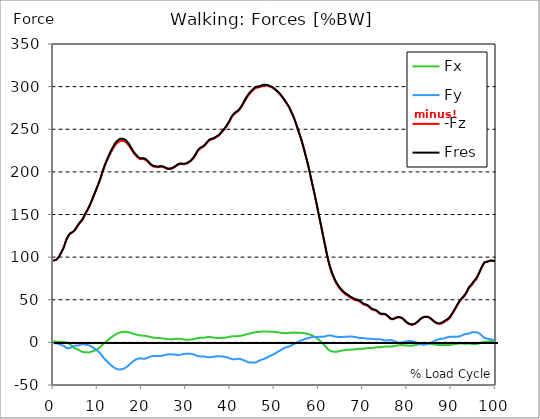
| Category |  Fx |  Fy |  -Fz |  Fres |
|---|---|---|---|---|
| 0.0 | 1.156 | -0.645 | 95.573 | 95.616 |
| 0.167348456675344 | 1.192 | -0.879 | 96.051 | 96.096 |
| 0.334696913350688 | 1.198 | -1.062 | 96.456 | 96.499 |
| 0.5020453700260321 | 1.049 | -1.068 | 96.72 | 96.764 |
| 0.669393826701376 | 0.87 | -1.04 | 96.957 | 97.005 |
| 0.83674228337672 | 0.809 | -1.318 | 97.771 | 97.825 |
| 1.0040907400520642 | 0.701 | -1.536 | 98.63 | 98.695 |
| 1.1621420602454444 | 0.6 | -1.845 | 99.788 | 99.866 |
| 1.3294905169207885 | 0.552 | -2.182 | 101.139 | 101.228 |
| 1.4968389735961325 | 0.556 | -2.518 | 102.6 | 102.702 |
| 1.6641874302714765 | 0.561 | -2.857 | 104.181 | 104.295 |
| 1.8315358869468206 | 0.558 | -3.168 | 105.804 | 105.93 |
| 1.9988843436221646 | 0.429 | -3.5 | 107.55 | 107.69 |
| 2.1662328002975086 | 0.328 | -3.84 | 109.35 | 109.507 |
| 2.333581256972853 | 0.22 | -4.194 | 111.26 | 111.43 |
| 2.5009297136481967 | 0.17 | -4.649 | 113.478 | 113.666 |
| 2.6682781703235405 | 0.196 | -5.332 | 116.042 | 116.263 |
| 2.8356266269988843 | 0.195 | -6.129 | 118.728 | 118.99 |
| 3.002975083674229 | -0.019 | -6.548 | 120.91 | 121.189 |
| 3.1703235403495724 | -0.459 | -6.707 | 122.649 | 122.938 |
| 3.337671997024917 | -0.844 | -6.951 | 124.301 | 124.606 |
| 3.4957233172182973 | -1.311 | -7.036 | 125.766 | 126.08 |
| 3.663071773893641 | -1.941 | -6.802 | 126.87 | 127.18 |
| 3.8304202305689854 | -2.616 | -6.432 | 127.683 | 127.983 |
| 3.997768687244329 | -3.416 | -5.903 | 128.219 | 128.512 |
| 4.165117143919673 | -4.283 | -5.321 | 128.619 | 128.911 |
| 4.332465600595017 | -5.116 | -4.802 | 129.119 | 129.43 |
| 4.499814057270361 | -5.872 | -4.375 | 129.69 | 130.023 |
| 4.667162513945706 | -6.461 | -4.115 | 130.492 | 130.853 |
| 4.834510970621049 | -7.047 | -3.798 | 131.417 | 131.809 |
| 5.001859427296393 | -7.404 | -3.682 | 132.612 | 133.017 |
| 5.169207883971737 | -7.706 | -3.648 | 133.901 | 134.317 |
| 5.336556340647081 | -7.973 | -3.677 | 135.261 | 135.69 |
| 5.503904797322425 | -8.278 | -3.597 | 136.581 | 137.015 |
| 5.671253253997769 | -8.612 | -3.504 | 137.969 | 138.408 |
| 5.82930457419115 | -9.087 | -3.337 | 139.183 | 139.631 |
| 5.996653030866494 | -9.593 | -3.096 | 140.275 | 140.735 |
| 6.164001487541838 | -10.127 | -2.754 | 141.275 | 141.753 |
| 6.331349944217181 | -10.672 | -2.383 | 142.25 | 142.75 |
| 6.498698400892526 | -11.134 | -2.033 | 143.225 | 143.75 |
| 6.66604685756787 | -11.376 | -1.953 | 144.61 | 145.144 |
| 6.833395314243213 | -11.457 | -2.185 | 146.348 | 146.883 |
| 7.000743770918558 | -11.501 | -2.461 | 148.157 | 148.693 |
| 7.168092227593902 | -11.536 | -2.763 | 150.05 | 150.584 |
| 7.335440684269246 | -11.675 | -2.797 | 151.616 | 152.152 |
| 7.50278914094459 | -11.689 | -2.891 | 153.097 | 153.634 |
| 7.6701375976199335 | -11.684 | -3.032 | 154.637 | 155.175 |
| 7.837486054295278 | -11.745 | -3.15 | 156.245 | 156.785 |
| 7.995537374488658 | -11.756 | -3.319 | 157.92 | 158.462 |
| 8.162885831164003 | -11.648 | -3.634 | 159.749 | 160.289 |
| 8.330234287839346 | -11.443 | -4.078 | 161.693 | 162.23 |
| 8.49758274451469 | -11.195 | -4.568 | 163.729 | 164.26 |
| 8.664931201190035 | -10.897 | -5.084 | 165.847 | 166.368 |
| 8.832279657865378 | -10.568 | -5.662 | 168.018 | 168.534 |
| 8.999628114540721 | -10.205 | -6.308 | 170.234 | 170.75 |
| 9.166976571216066 | -9.95 | -6.835 | 172.329 | 172.849 |
| 9.334325027891412 | -9.61 | -7.42 | 174.436 | 174.962 |
| 9.501673484566755 | -9.252 | -7.993 | 176.505 | 177.036 |
| 9.669021941242098 | -8.805 | -8.607 | 178.583 | 179.12 |
| 9.836370397917442 | -8.246 | -9.299 | 180.79 | 181.333 |
| 10.003718854592787 | -7.702 | -9.963 | 183 | 183.55 |
| 10.17106731126813 | -7.101 | -10.708 | 185.226 | 185.792 |
| 10.329118631461512 | -6.478 | -11.482 | 187.523 | 188.101 |
| 10.496467088136853 | -5.808 | -12.334 | 189.855 | 190.455 |
| 10.663815544812199 | -5.064 | -13.301 | 192.307 | 192.948 |
| 10.831164001487544 | -4.179 | -14.495 | 195.017 | 195.717 |
| 10.998512458162887 | -3.233 | -15.789 | 197.836 | 198.596 |
| 11.16586091483823 | -2.393 | -16.877 | 200.404 | 201.229 |
| 11.333209371513574 | -1.591 | -17.906 | 202.864 | 203.753 |
| 11.50055782818892 | -0.795 | -18.9 | 205.273 | 206.225 |
| 11.667906284864264 | -0.002 | -19.897 | 207.598 | 208.626 |
| 11.835254741539607 | 0.733 | -20.819 | 209.733 | 210.839 |
| 12.00260319821495 | 1.413 | -21.647 | 211.745 | 212.92 |
| 12.169951654890292 | 2.081 | -22.461 | 213.702 | 214.95 |
| 12.337300111565641 | 2.765 | -23.325 | 215.614 | 216.944 |
| 12.504648568240984 | 3.452 | -24.168 | 217.438 | 218.86 |
| 12.662699888434362 | 4.148 | -25.009 | 219.259 | 220.774 |
| 12.830048345109708 | 4.838 | -25.835 | 221.072 | 222.679 |
| 12.997396801785053 | 5.515 | -26.644 | 222.837 | 224.536 |
| 13.164745258460396 | 6.169 | -27.405 | 224.463 | 226.259 |
| 13.33209371513574 | 6.839 | -28.13 | 225.992 | 227.889 |
| 13.499442171811083 | 7.364 | -28.673 | 227.35 | 229.323 |
| 13.666790628486426 | 7.888 | -29.215 | 228.743 | 230.792 |
| 13.834139085161771 | 8.485 | -29.844 | 230.244 | 232.381 |
| 14.001487541837117 | 9.052 | -30.396 | 231.506 | 233.728 |
| 14.16883599851246 | 9.585 | -30.879 | 232.575 | 234.875 |
| 14.336184455187803 | 10.043 | -31.222 | 233.457 | 235.817 |
| 14.503532911863147 | 10.451 | -31.477 | 234.224 | 236.632 |
| 14.670881368538492 | 10.82 | -31.675 | 234.951 | 237.398 |
| 14.828932688731873 | 11.166 | -31.831 | 235.625 | 238.105 |
| 14.996281145407215 | 11.479 | -31.909 | 236.106 | 238.61 |
| 15.163629602082558 | 11.718 | -31.825 | 236.374 | 238.878 |
| 15.330978058757903 | 11.907 | -31.61 | 236.504 | 238.99 |
| 15.498326515433247 | 12.103 | -31.43 | 236.517 | 238.99 |
| 15.665674972108594 | 12.251 | -31.197 | 236.469 | 238.92 |
| 15.833023428783937 | 12.365 | -30.957 | 236.367 | 238.795 |
| 16.00037188545928 | 12.425 | -30.54 | 236.059 | 238.441 |
| 16.167720342134626 | 12.43 | -30.09 | 235.655 | 237.984 |
| 16.335068798809967 | 12.387 | -29.576 | 235.058 | 237.326 |
| 16.502417255485312 | 12.305 | -28.983 | 234.344 | 236.538 |
| 16.669765712160658 | 12.171 | -28.352 | 233.485 | 235.6 |
| 16.837114168836 | 12.022 | -27.717 | 232.579 | 234.614 |
| 17.004462625511344 | 11.805 | -26.957 | 231.429 | 233.37 |
| 17.16251394570472 | 11.6 | -26.179 | 230.204 | 232.05 |
| 17.32986240238007 | 11.318 | -25.332 | 228.784 | 230.531 |
| 17.497210859055414 | 11.029 | -24.582 | 227.521 | 229.182 |
| 17.664559315730756 | 10.739 | -23.778 | 226.227 | 227.795 |
| 17.8319077724061 | 10.461 | -22.94 | 224.794 | 226.269 |
| 17.999256229081443 | 10.201 | -22.183 | 223.338 | 224.733 |
| 18.166604685756788 | 9.954 | -21.577 | 222.08 | 223.409 |
| 18.333953142432133 | 9.676 | -21.027 | 220.966 | 222.231 |
| 18.501301599107478 | 9.434 | -20.632 | 220.08 | 221.302 |
| 18.668650055782823 | 9.207 | -20.182 | 219.156 | 220.332 |
| 18.835998512458165 | 8.947 | -19.792 | 218.259 | 219.391 |
| 19.00334696913351 | 8.743 | -19.457 | 217.411 | 218.506 |
| 19.170695425808855 | 8.555 | -19.139 | 216.545 | 217.606 |
| 19.338043882484197 | 8.345 | -18.799 | 215.688 | 216.715 |
| 19.496095202677576 | 8.168 | -18.661 | 215.199 | 216.208 |
| 19.66344365935292 | 8.068 | -18.703 | 215.017 | 216.027 |
| 19.830792116028263 | 7.986 | -18.775 | 214.943 | 215.956 |
| 19.998140572703612 | 7.949 | -19.069 | 215.137 | 216.174 |
| 20.165489029378953 | 7.933 | -19.319 | 215.137 | 216.195 |
| 20.3328374860543 | 7.886 | -19.301 | 214.925 | 215.981 |
| 20.500185942729644 | 7.823 | -19.191 | 214.754 | 215.797 |
| 20.667534399404985 | 7.72 | -19.084 | 214.539 | 215.57 |
| 20.83488285608033 | 7.577 | -18.937 | 214.148 | 215.162 |
| 21.002231312755672 | 7.435 | -18.732 | 213.541 | 214.536 |
| 21.16957976943102 | 7.286 | -18.44 | 212.879 | 213.848 |
| 21.336928226106362 | 7.082 | -18.045 | 212.01 | 212.944 |
| 21.504276682781704 | 6.829 | -17.583 | 211.006 | 211.903 |
| 21.67162513945705 | 6.624 | -17.24 | 210.076 | 210.945 |
| 21.82967645965043 | 6.406 | -16.873 | 209.191 | 210.026 |
| 21.997024916325774 | 6.191 | -16.549 | 208.387 | 209.193 |
| 22.16437337300112 | 5.997 | -16.313 | 207.683 | 208.467 |
| 22.33172182967646 | 5.845 | -16.135 | 207.062 | 207.831 |
| 22.499070286351806 | 5.683 | -16.084 | 206.548 | 207.31 |
| 22.666418743027148 | 5.591 | -16.019 | 206.222 | 206.98 |
| 22.833767199702496 | 5.508 | -15.999 | 206.086 | 206.84 |
| 23.00111565637784 | 5.448 | -16.043 | 206.044 | 206.797 |
| 23.168464113053183 | 5.379 | -16.048 | 205.938 | 206.688 |
| 23.335812569728528 | 5.273 | -15.972 | 205.673 | 206.414 |
| 23.50316102640387 | 5.163 | -15.943 | 205.417 | 206.152 |
| 23.670509483079215 | 5.117 | -15.933 | 205.468 | 206.202 |
| 23.83785793975456 | 5.074 | -15.934 | 205.579 | 206.311 |
| 23.995909259947936 | 5.05 | -15.941 | 205.781 | 206.512 |
| 24.163257716623285 | 5.012 | -15.923 | 205.977 | 206.705 |
| 24.330606173298627 | 4.903 | -15.825 | 206.082 | 206.798 |
| 24.49795462997397 | 4.806 | -15.74 | 206.108 | 206.816 |
| 24.665303086649313 | 4.713 | -15.621 | 205.93 | 206.626 |
| 24.83265154332466 | 4.63 | -15.478 | 205.609 | 206.293 |
| 25.0 | 4.545 | -15.304 | 205.274 | 205.943 |
| 25.167348456675345 | 4.402 | -15.088 | 204.918 | 205.572 |
| 25.334696913350694 | 4.227 | -14.845 | 204.5 | 205.135 |
| 25.502045370026035 | 4.049 | -14.575 | 204.024 | 204.64 |
| 25.669393826701377 | 3.885 | -14.32 | 203.588 | 204.185 |
| 25.836742283376722 | 3.777 | -14.128 | 203.306 | 203.888 |
| 26.004090740052067 | 3.712 | -14.017 | 203.219 | 203.795 |
| 26.17143919672741 | 3.695 | -14.006 | 203.262 | 203.839 |
| 26.329490516920792 | 3.67 | -13.998 | 203.297 | 203.875 |
| 26.49683897359613 | 3.652 | -14 | 203.373 | 203.952 |
| 26.66418743027148 | 3.672 | -14.029 | 203.612 | 204.194 |
| 26.831535886946828 | 3.717 | -14.098 | 203.983 | 204.571 |
| 26.998884343622166 | 3.759 | -14.161 | 204.36 | 204.95 |
| 27.166232800297514 | 3.809 | -14.217 | 204.756 | 205.349 |
| 27.333581256972852 | 3.885 | -14.289 | 205.251 | 205.848 |
| 27.5009297136482 | 3.962 | -14.359 | 205.805 | 206.405 |
| 27.668278170323543 | 4.053 | -14.491 | 206.514 | 207.122 |
| 27.835626626998888 | 4.139 | -14.63 | 207.214 | 207.83 |
| 28.002975083674233 | 4.186 | -14.721 | 207.781 | 208.401 |
| 28.170323540349575 | 4.204 | -14.746 | 208.245 | 208.864 |
| 28.33767199702492 | 4.198 | -14.754 | 208.661 | 209.279 |
| 28.50502045370026 | 4.172 | -14.699 | 209.038 | 209.649 |
| 28.663071773893645 | 4.094 | -14.54 | 209.251 | 209.848 |
| 28.830420230568986 | 3.98 | -14.346 | 209.346 | 209.924 |
| 28.99776868724433 | 3.821 | -14.113 | 209.266 | 209.826 |
| 29.165117143919673 | 3.661 | -13.913 | 209.159 | 209.703 |
| 29.33246560059502 | 3.509 | -13.748 | 209.067 | 209.597 |
| 29.499814057270367 | 3.371 | -13.6 | 209.026 | 209.544 |
| 29.66716251394571 | 3.258 | -13.487 | 209.083 | 209.59 |
| 29.834510970621054 | 3.173 | -13.392 | 209.228 | 209.725 |
| 30.00185942729639 | 3.129 | -13.338 | 209.493 | 209.983 |
| 30.169207883971744 | 3.125 | -13.355 | 209.837 | 210.326 |
| 30.33655634064708 | 3.135 | -13.356 | 210.309 | 210.795 |
| 30.50390479732243 | 3.149 | -13.35 | 210.805 | 211.289 |
| 30.671253253997772 | 3.164 | -13.317 | 211.285 | 211.767 |
| 30.829304574191156 | 3.224 | -13.345 | 211.861 | 212.343 |
| 30.996653030866494 | 3.297 | -13.389 | 212.465 | 212.95 |
| 31.164001487541842 | 3.414 | -13.535 | 213.272 | 213.766 |
| 31.331349944217187 | 3.554 | -13.695 | 214.18 | 214.684 |
| 31.498698400892525 | 3.717 | -13.895 | 215.188 | 215.707 |
| 31.666046857567874 | 3.883 | -14.12 | 216.262 | 216.795 |
| 31.833395314243212 | 4.052 | -14.373 | 217.372 | 217.922 |
| 32.00074377091856 | 4.234 | -14.683 | 218.732 | 219.307 |
| 32.1680922275939 | 4.448 | -15.038 | 220.179 | 220.781 |
| 32.33544068426925 | 4.715 | -15.505 | 221.775 | 222.414 |
| 32.50278914094459 | 4.932 | -15.893 | 223.312 | 223.984 |
| 32.670137597619934 | 5.084 | -16.152 | 224.628 | 225.324 |
| 32.83748605429528 | 5.192 | -16.326 | 225.697 | 226.405 |
| 33.004834510970625 | 5.251 | -16.399 | 226.531 | 227.243 |
| 33.162885831164004 | 5.312 | -16.438 | 227.279 | 227.991 |
| 33.33023428783935 | 5.335 | -16.444 | 227.923 | 228.637 |
| 33.497582744514695 | 5.34 | -16.443 | 228.385 | 229.098 |
| 33.664931201190036 | 5.358 | -16.432 | 228.843 | 229.553 |
| 33.83227965786538 | 5.382 | -16.418 | 229.306 | 230.015 |
| 33.99962811454073 | 5.445 | -16.465 | 229.868 | 230.58 |
| 34.16697657121607 | 5.563 | -16.58 | 230.583 | 231.301 |
| 34.33432502789141 | 5.722 | -16.729 | 231.478 | 232.206 |
| 34.50167348456676 | 5.886 | -16.899 | 232.482 | 233.22 |
| 34.6690219412421 | 6.05 | -17.105 | 233.643 | 234.397 |
| 34.83637039791744 | 6.139 | -17.284 | 234.729 | 235.496 |
| 35.00371885459279 | 6.233 | -17.445 | 235.704 | 236.483 |
| 35.17106731126814 | 6.288 | -17.524 | 236.534 | 237.318 |
| 35.338415767943474 | 6.289 | -17.513 | 237.192 | 237.972 |
| 35.49646708813686 | 6.214 | -17.427 | 237.657 | 238.427 |
| 35.6638155448122 | 6.085 | -17.288 | 238.002 | 238.756 |
| 35.831164001487544 | 5.923 | -17.111 | 238.24 | 238.974 |
| 35.998512458162885 | 5.743 | -16.925 | 238.404 | 239.118 |
| 36.165860914838234 | 5.65 | -16.865 | 238.772 | 239.478 |
| 36.333209371513576 | 5.572 | -16.828 | 239.209 | 239.91 |
| 36.50055782818892 | 5.45 | -16.713 | 239.669 | 240.357 |
| 36.667906284864266 | 5.378 | -16.603 | 240.248 | 240.923 |
| 36.83525474153961 | 5.3 | -16.465 | 240.804 | 241.467 |
| 37.002603198214956 | 5.187 | -16.296 | 241.214 | 241.861 |
| 37.1699516548903 | 5.108 | -16.214 | 241.675 | 242.316 |
| 37.337300111565646 | 5.08 | -16.213 | 242.382 | 243.02 |
| 37.50464856824098 | 5.105 | -16.271 | 243.208 | 243.849 |
| 37.66269988843437 | 5.153 | -16.35 | 244.078 | 244.722 |
| 37.83004834510971 | 5.172 | -16.441 | 245.044 | 245.692 |
| 37.99739680178505 | 5.235 | -16.556 | 246.065 | 246.719 |
| 38.16474525846039 | 5.317 | -16.654 | 247.028 | 247.69 |
| 38.33209371513574 | 5.373 | -16.693 | 248.003 | 248.666 |
| 38.49944217181109 | 5.422 | -16.738 | 248.996 | 249.661 |
| 38.666790628486424 | 5.494 | -16.851 | 250.048 | 250.719 |
| 38.83413908516178 | 5.602 | -17.057 | 251.244 | 251.927 |
| 39.001487541837115 | 5.692 | -17.247 | 252.45 | 253.146 |
| 39.16883599851246 | 5.786 | -17.416 | 253.681 | 254.386 |
| 39.336184455187805 | 5.927 | -17.638 | 255.006 | 255.725 |
| 39.503532911863154 | 6.099 | -17.899 | 256.375 | 257.114 |
| 39.670881368538495 | 6.27 | -18.168 | 257.795 | 258.552 |
| 39.83822982521384 | 6.453 | -18.451 | 259.302 | 260.078 |
| 39.996281145407224 | 6.697 | -18.883 | 261.027 | 261.834 |
| 40.163629602082565 | 6.933 | -19.316 | 262.749 | 263.588 |
| 40.33097805875791 | 7.125 | -19.65 | 264.231 | 265.096 |
| 40.498326515433256 | 7.24 | -19.834 | 265.467 | 266.345 |
| 40.6656749721086 | 7.267 | -19.895 | 266.488 | 267.369 |
| 40.83302342878393 | 7.306 | -19.947 | 267.433 | 268.315 |
| 41.00037188545929 | 7.285 | -19.893 | 268.268 | 269.141 |
| 41.16772034213463 | 7.284 | -19.815 | 269.04 | 269.902 |
| 41.33506879880997 | 7.315 | -19.669 | 269.61 | 270.459 |
| 41.50241725548531 | 7.308 | -19.47 | 270.094 | 270.926 |
| 41.66976571216066 | 7.328 | -19.305 | 270.718 | 271.538 |
| 41.837114168836 | 7.37 | -19.219 | 271.475 | 272.287 |
| 42.004462625511344 | 7.441 | -19.255 | 272.411 | 273.226 |
| 42.17181108218669 | 7.543 | -19.417 | 273.55 | 274.376 |
| 42.32986240238007 | 7.664 | -19.601 | 274.721 | 275.561 |
| 42.497210859055414 | 7.849 | -19.865 | 276.012 | 276.873 |
| 42.66455931573076 | 8.078 | -20.248 | 277.513 | 278.402 |
| 42.831907772406105 | 8.312 | -20.604 | 279.032 | 279.949 |
| 42.999256229081446 | 8.518 | -20.907 | 280.514 | 281.453 |
| 43.16660468575679 | 8.695 | -21.254 | 282.037 | 283.002 |
| 43.33395314243214 | 8.93 | -21.624 | 283.55 | 284.545 |
| 43.50130159910748 | 9.21 | -21.994 | 285.091 | 286.117 |
| 43.66865005578282 | 9.487 | -22.372 | 286.59 | 287.648 |
| 43.83599851245817 | 9.722 | -22.739 | 287.907 | 288.994 |
| 44.00334696913351 | 9.967 | -23.082 | 289.135 | 290.252 |
| 44.17069542580886 | 10.219 | -23.348 | 290.324 | 291.467 |
| 44.3380438824842 | 10.45 | -23.552 | 291.447 | 292.611 |
| 44.49609520267758 | 10.617 | -23.661 | 292.391 | 293.566 |
| 44.66344365935292 | 10.729 | -23.627 | 293.225 | 294.399 |
| 44.83079211602827 | 10.882 | -23.635 | 294.082 | 295.259 |
| 44.99814057270361 | 11.084 | -23.682 | 294.972 | 296.158 |
| 45.16548902937895 | 11.305 | -23.744 | 295.894 | 297.09 |
| 45.332837486054295 | 11.535 | -23.778 | 296.757 | 297.961 |
| 45.500185942729644 | 11.731 | -23.752 | 297.533 | 298.74 |
| 45.66753439940499 | 11.927 | -23.658 | 298.164 | 299.367 |
| 45.83488285608033 | 12.108 | -23.426 | 298.645 | 299.835 |
| 46.00223131275568 | 12.169 | -22.982 | 298.856 | 300.014 |
| 46.16957976943102 | 12.172 | -22.504 | 298.939 | 300.063 |
| 46.336928226106366 | 12.183 | -22.008 | 299.031 | 300.121 |
| 46.50427668278171 | 12.235 | -21.463 | 299.186 | 300.244 |
| 46.671625139457056 | 12.347 | -21.144 | 299.563 | 300.601 |
| 46.829676459650436 | 12.449 | -20.829 | 299.922 | 300.945 |
| 46.99702491632577 | 12.536 | -20.513 | 300.293 | 301.298 |
| 47.16437337300112 | 12.626 | -20.223 | 300.723 | 301.71 |
| 47.33172182967646 | 12.658 | -19.893 | 301.026 | 301.991 |
| 47.49907028635181 | 12.702 | -19.632 | 301.133 | 302.085 |
| 47.66641874302716 | 12.719 | -19.315 | 301.185 | 302.121 |
| 47.83376719970249 | 12.717 | -18.957 | 301.222 | 302.14 |
| 48.001115656377834 | 12.726 | -18.586 | 301.222 | 302.118 |
| 48.16846411305319 | 12.724 | -18.21 | 301.166 | 302.037 |
| 48.33581256972853 | 12.716 | -17.846 | 301.087 | 301.934 |
| 48.50316102640387 | 12.69 | -17.432 | 300.926 | 301.746 |
| 48.67050948307921 | 12.647 | -16.937 | 300.667 | 301.454 |
| 48.837857939754564 | 12.566 | -16.379 | 300.285 | 301.04 |
| 49.005206396429905 | 12.527 | -15.852 | 299.904 | 300.629 |
| 49.163257716623285 | 12.517 | -15.498 | 299.613 | 300.321 |
| 49.33060617329863 | 12.502 | -15.153 | 299.285 | 299.975 |
| 49.49795462997397 | 12.439 | -14.733 | 298.823 | 299.488 |
| 49.66530308664932 | 12.341 | -14.256 | 298.297 | 298.933 |
| 49.832651543324666 | 12.293 | -13.804 | 297.727 | 298.34 |
| 50.0 | 12.22 | -13.325 | 297.069 | 297.658 |
| 50.16734845667534 | 12.14 | -12.835 | 296.375 | 296.94 |
| 50.33469691335069 | 12.052 | -12.312 | 295.64 | 296.18 |
| 50.50204537002604 | 11.942 | -11.743 | 294.811 | 295.322 |
| 50.66939382670139 | 11.801 | -11.258 | 294.013 | 294.501 |
| 50.836742283376715 | 11.687 | -10.775 | 293.285 | 293.753 |
| 51.00409074005207 | 11.615 | -10.332 | 292.485 | 292.938 |
| 51.17143919672741 | 11.502 | -9.847 | 291.519 | 291.951 |
| 51.32949051692079 | 11.356 | -9.326 | 290.487 | 290.897 |
| 51.496838973596134 | 11.224 | -8.753 | 289.438 | 289.824 |
| 51.66418743027148 | 11.127 | -8.25 | 288.346 | 288.715 |
| 51.831535886946824 | 11.051 | -7.787 | 287.215 | 287.569 |
| 51.99888434362217 | 10.975 | -7.311 | 286.047 | 286.383 |
| 52.16623280029752 | 10.901 | -6.832 | 284.887 | 285.206 |
| 52.33358125697285 | 10.857 | -6.409 | 283.655 | 283.963 |
| 52.5009297136482 | 10.848 | -6.037 | 282.337 | 282.64 |
| 52.668278170323546 | 10.836 | -5.653 | 280.961 | 281.258 |
| 52.835626626998895 | 10.871 | -5.319 | 279.574 | 279.869 |
| 53.00297508367424 | 11.045 | -5.162 | 278.287 | 278.587 |
| 53.17032354034958 | 11.199 | -5.01 | 276.932 | 277.235 |
| 53.33767199702492 | 11.312 | -4.828 | 275.443 | 275.746 |
| 53.50502045370027 | 11.299 | -4.413 | 273.62 | 273.915 |
| 53.663071773893655 | 11.262 | -3.953 | 271.724 | 272.012 |
| 53.83042023056899 | 11.266 | -3.514 | 269.825 | 270.107 |
| 53.99776868724433 | 11.286 | -3.089 | 267.881 | 268.16 |
| 54.16511714391967 | 11.311 | -2.622 | 265.889 | 266.166 |
| 54.33246560059503 | 11.344 | -2.168 | 263.775 | 264.053 |
| 54.49981405727037 | 11.403 | -1.748 | 261.626 | 261.908 |
| 54.667162513945705 | 11.488 | -1.322 | 259.408 | 259.694 |
| 54.834510970621054 | 11.48 | -0.815 | 256.945 | 257.232 |
| 55.0018594272964 | 11.401 | -0.269 | 254.347 | 254.634 |
| 55.169207883971744 | 11.305 | 0.24 | 251.735 | 252.022 |
| 55.336556340647086 | 11.198 | 0.73 | 249.028 | 249.316 |
| 55.50390479732243 | 11.13 | 1.181 | 246.318 | 246.606 |
| 55.671253253997776 | 11.17 | 1.461 | 243.868 | 244.157 |
| 55.83860171067312 | 11.22 | 1.676 | 241.406 | 241.699 |
| 55.9966530308665 | 11.204 | 2.025 | 238.611 | 238.91 |
| 56.16400148754184 | 11.163 | 2.405 | 235.716 | 236.019 |
| 56.33134994421718 | 11.099 | 2.766 | 232.702 | 233.013 |
| 56.498698400892536 | 10.962 | 3.135 | 229.589 | 229.904 |
| 56.66604685756788 | 10.799 | 3.501 | 226.34 | 226.656 |
| 56.83339531424321 | 10.631 | 3.838 | 223.031 | 223.349 |
| 57.00074377091856 | 10.486 | 4.121 | 219.761 | 220.08 |
| 57.16809222759391 | 10.348 | 4.382 | 216.495 | 216.816 |
| 57.33544068426925 | 10.2 | 4.572 | 213.178 | 213.5 |
| 57.5027891409446 | 10.01 | 4.752 | 209.783 | 210.105 |
| 57.670137597619934 | 9.775 | 4.962 | 206.274 | 206.595 |
| 57.83748605429528 | 9.479 | 5.216 | 202.492 | 202.812 |
| 58.004834510970625 | 9.149 | 5.515 | 198.542 | 198.86 |
| 58.16288583116401 | 8.803 | 5.819 | 194.558 | 194.876 |
| 58.330234287839346 | 8.466 | 5.991 | 190.638 | 190.952 |
| 58.497582744514695 | 8.106 | 6.148 | 186.673 | 186.983 |
| 58.66493120119004 | 7.734 | 6.281 | 182.739 | 183.041 |
| 58.832279657865385 | 7.367 | 6.347 | 178.941 | 179.237 |
| 58.999628114540734 | 6.934 | 6.344 | 175.069 | 175.353 |
| 59.16697657121607 | 6.441 | 6.353 | 171.062 | 171.335 |
| 59.33432502789142 | 5.891 | 6.391 | 166.948 | 167.21 |
| 59.50167348456676 | 5.317 | 6.443 | 162.777 | 163.028 |
| 59.66902194124211 | 4.73 | 6.507 | 158.559 | 158.801 |
| 59.83637039791745 | 4.075 | 6.528 | 154.322 | 154.552 |
| 60.00371885459278 | 3.317 | 6.523 | 150.056 | 150.279 |
| 60.17106731126813 | 2.556 | 6.508 | 145.867 | 146.083 |
| 60.33841576794349 | 1.76 | 6.492 | 141.649 | 141.861 |
| 60.49646708813685 | 0.916 | 6.465 | 137.412 | 137.623 |
| 60.6638155448122 | 0.108 | 6.458 | 133.248 | 133.463 |
| 60.831164001487544 | -0.775 | 6.518 | 128.968 | 129.195 |
| 60.99851245816289 | -1.683 | 6.605 | 124.635 | 124.883 |
| 61.16586091483824 | -2.596 | 6.719 | 120.471 | 120.765 |
| 61.333209371513576 | -3.578 | 6.896 | 116.181 | 116.538 |
| 61.50055782818892 | -4.579 | 7.098 | 111.871 | 112.299 |
| 61.667906284864266 | -5.604 | 7.329 | 107.56 | 108.07 |
| 61.835254741539615 | -6.589 | 7.647 | 103.385 | 103.992 |
| 62.002603198214956 | -7.553 | 7.93 | 99.267 | 99.989 |
| 62.16995165489029 | -8.356 | 8.052 | 95.487 | 96.316 |
| 62.33730011156564 | -9.017 | 8.135 | 92.088 | 93.009 |
| 62.504648568240995 | -9.598 | 8.181 | 88.931 | 89.93 |
| 62.67199702491633 | -10.062 | 8.119 | 86.012 | 87.091 |
| 62.83004834510971 | -10.439 | 8.006 | 83.258 | 84.408 |
| 62.99739680178505 | -10.712 | 7.783 | 80.605 | 81.799 |
| 63.1647452584604 | -10.839 | 7.492 | 78.318 | 79.532 |
| 63.33209371513575 | -10.927 | 7.227 | 76.192 | 77.421 |
| 63.4994421718111 | -10.973 | 6.99 | 74.247 | 75.488 |
| 63.666790628486424 | -10.993 | 6.858 | 72.444 | 73.702 |
| 63.83413908516177 | -10.992 | 6.742 | 70.709 | 71.979 |
| 64.00148754183712 | -10.992 | 6.672 | 68.992 | 70.28 |
| 64.16883599851248 | -10.878 | 6.519 | 67.509 | 68.786 |
| 64.3361844551878 | -10.692 | 6.416 | 66.225 | 67.488 |
| 64.50353291186315 | -10.483 | 6.252 | 64.962 | 66.201 |
| 64.6708813685385 | -10.288 | 6.234 | 63.725 | 64.955 |
| 64.83822982521384 | -10.076 | 6.217 | 62.625 | 63.839 |
| 65.00557828188919 | -9.859 | 6.216 | 61.64 | 62.832 |
| 65.16362960208257 | -9.668 | 6.23 | 60.694 | 61.867 |
| 65.3309780587579 | -9.498 | 6.277 | 59.776 | 60.938 |
| 65.49832651543326 | -9.35 | 6.326 | 58.896 | 60.052 |
| 65.6656749721086 | -9.237 | 6.479 | 58.069 | 59.228 |
| 65.83302342878395 | -9.109 | 6.576 | 57.297 | 58.455 |
| 66.00037188545929 | -8.972 | 6.628 | 56.586 | 57.74 |
| 66.16772034213463 | -8.836 | 6.612 | 56.022 | 57.161 |
| 66.33506879880998 | -8.745 | 6.657 | 55.521 | 56.658 |
| 66.50241725548531 | -8.662 | 6.715 | 55.033 | 56.17 |
| 66.66976571216065 | -8.607 | 6.762 | 54.417 | 55.561 |
| 66.83711416883601 | -8.608 | 6.802 | 53.747 | 54.904 |
| 67.00446262551135 | -8.616 | 6.865 | 53.034 | 54.212 |
| 67.1718110821867 | -8.578 | 6.877 | 52.428 | 53.612 |
| 67.32986240238007 | -8.525 | 6.854 | 51.889 | 53.07 |
| 67.49721085905541 | -8.432 | 6.82 | 51.444 | 52.613 |
| 67.66455931573076 | -8.359 | 6.693 | 51.068 | 52.221 |
| 67.83190777240611 | -8.306 | 6.575 | 50.664 | 51.806 |
| 67.99925622908145 | -8.253 | 6.471 | 50.246 | 51.377 |
| 68.16660468575678 | -8.183 | 6.395 | 49.828 | 50.946 |
| 68.33395314243214 | -8.099 | 6.301 | 49.451 | 50.551 |
| 68.50130159910749 | -7.963 | 6.055 | 49.291 | 50.339 |
| 68.66865005578282 | -7.829 | 5.794 | 49.187 | 50.181 |
| 68.83599851245816 | -7.703 | 5.54 | 49.101 | 50.042 |
| 69.00334696913352 | -7.617 | 5.347 | 48.803 | 49.714 |
| 69.17069542580886 | -7.567 | 5.247 | 48.311 | 49.211 |
| 69.3380438824842 | -7.566 | 5.161 | 47.726 | 48.626 |
| 69.50539233915956 | -7.554 | 5.103 | 47.104 | 48.006 |
| 69.66344365935292 | -7.553 | 5.138 | 46.35 | 47.268 |
| 69.83079211602826 | -7.554 | 5.185 | 45.584 | 46.517 |
| 69.99814057270362 | -7.535 | 5.196 | 44.885 | 45.828 |
| 70.16548902937896 | -7.471 | 5.111 | 44.365 | 45.298 |
| 70.33283748605429 | -7.342 | 4.935 | 44.068 | 44.967 |
| 70.50018594272964 | -7.17 | 4.743 | 43.881 | 44.735 |
| 70.667534399405 | -6.998 | 4.542 | 43.7 | 44.511 |
| 70.83488285608033 | -6.858 | 4.379 | 43.422 | 44.2 |
| 71.00223131275568 | -6.757 | 4.25 | 43.013 | 43.77 |
| 71.16957976943102 | -6.685 | 4.183 | 42.456 | 43.207 |
| 71.33692822610637 | -6.655 | 4.189 | 41.775 | 42.535 |
| 71.50427668278171 | -6.658 | 4.222 | 40.993 | 41.773 |
| 71.67162513945706 | -6.663 | 4.264 | 40.194 | 40.995 |
| 71.8389735961324 | -6.663 | 4.297 | 39.417 | 40.237 |
| 71.99702491632577 | -6.631 | 4.289 | 38.741 | 39.567 |
| 72.16437337300113 | -6.547 | 4.208 | 38.29 | 39.102 |
| 72.33172182967647 | -6.394 | 4.071 | 38.074 | 38.85 |
| 72.49907028635181 | -6.238 | 3.925 | 37.878 | 38.616 |
| 72.66641874302715 | -6.083 | 3.788 | 37.675 | 38.378 |
| 72.8337671997025 | -5.929 | 3.657 | 37.474 | 38.143 |
| 73.00111565637783 | -5.82 | 3.557 | 37.117 | 37.764 |
| 73.16846411305319 | -5.804 | 3.57 | 36.424 | 37.084 |
| 73.33581256972853 | -5.808 | 3.608 | 35.666 | 36.348 |
| 73.50316102640387 | -5.813 | 3.665 | 34.879 | 35.582 |
| 73.67050948307921 | -5.815 | 3.725 | 34.111 | 34.833 |
| 73.83785793975457 | -5.811 | 3.75 | 33.405 | 34.143 |
| 74.00520639642991 | -5.752 | 3.634 | 33.009 | 33.733 |
| 74.16325771662328 | -5.615 | 3.442 | 32.883 | 33.572 |
| 74.33060617329863 | -5.452 | 3.2 | 32.894 | 33.534 |
| 74.49795462997398 | -5.287 | 2.959 | 32.906 | 33.497 |
| 74.66530308664932 | -5.115 | 2.68 | 32.985 | 33.521 |
| 74.83265154332466 | -4.948 | 2.436 | 33.014 | 33.5 |
| 75.00000000000001 | -4.837 | 2.323 | 32.809 | 33.273 |
| 75.16734845667534 | -4.781 | 2.29 | 32.413 | 32.874 |
| 75.3346969133507 | -4.766 | 2.326 | 31.809 | 32.281 |
| 75.50204537002605 | -4.766 | 2.377 | 31.088 | 31.58 |
| 75.66939382670138 | -4.785 | 2.429 | 30.314 | 30.829 |
| 75.83674228337672 | -4.823 | 2.513 | 29.5 | 30.046 |
| 76.00409074005208 | -4.909 | 2.679 | 28.531 | 29.136 |
| 76.17143919672742 | -4.943 | 2.746 | 27.795 | 28.429 |
| 76.33878765340276 | -4.942 | 2.72 | 27.29 | 27.94 |
| 76.49683897359614 | -4.885 | 2.571 | 27.084 | 27.73 |
| 76.66418743027148 | -4.775 | 2.326 | 27.035 | 27.643 |
| 76.83153588694682 | -4.64 | 2.047 | 27.085 | 27.641 |
| 76.99888434362218 | -4.47 | 1.699 | 27.364 | 27.841 |
| 77.16623280029752 | -4.286 | 1.346 | 27.814 | 28.239 |
| 77.33358125697285 | -4.08 | 0.973 | 28.382 | 28.754 |
| 77.5009297136482 | -3.897 | 0.682 | 28.716 | 29.05 |
| 77.66827817032356 | -3.737 | 0.429 | 29.033 | 29.342 |
| 77.83562662699889 | -3.575 | 0.169 | 29.265 | 29.544 |
| 78.00297508367423 | -3.415 | -0.073 | 29.447 | 29.696 |
| 78.17032354034959 | -3.316 | -0.183 | 29.512 | 29.744 |
| 78.33767199702493 | -3.273 | -0.17 | 29.265 | 29.49 |
| 78.50502045370027 | -3.226 | -0.176 | 29.017 | 29.236 |
| 78.67236891037561 | -3.187 | -0.166 | 28.747 | 28.959 |
| 78.83042023056899 | -3.184 | -0.089 | 28.371 | 28.583 |
| 78.99776868724433 | -3.217 | 0.058 | 27.775 | 27.996 |
| 79.16511714391969 | -3.281 | 0.265 | 26.991 | 27.23 |
| 79.33246560059503 | -3.358 | 0.484 | 26.129 | 26.393 |
| 79.49981405727036 | -3.458 | 0.758 | 25.252 | 25.544 |
| 79.66716251394571 | -3.566 | 1.027 | 24.391 | 24.705 |
| 79.83451097062107 | -3.654 | 1.231 | 23.613 | 23.95 |
| 80.00185942729641 | -3.725 | 1.377 | 22.915 | 23.279 |
| 80.16920788397174 | -3.772 | 1.46 | 22.302 | 22.692 |
| 80.33655634064709 | -3.811 | 1.521 | 21.776 | 22.191 |
| 80.50390479732243 | -3.833 | 1.55 | 21.357 | 21.789 |
| 80.67125325399778 | -3.845 | 1.557 | 21.03 | 21.476 |
| 80.83860171067312 | -3.857 | 1.572 | 20.722 | 21.183 |
| 80.99665303086651 | -3.816 | 1.493 | 20.576 | 21.031 |
| 81.16400148754184 | -3.741 | 1.33 | 20.638 | 21.072 |
| 81.3313499442172 | -3.612 | 1.077 | 20.913 | 21.308 |
| 81.49869840089255 | -3.474 | 0.788 | 21.194 | 21.553 |
| 81.66604685756786 | -3.337 | 0.483 | 21.555 | 21.88 |
| 81.83339531424322 | -3.206 | 0.183 | 21.983 | 22.274 |
| 82.00074377091858 | -3.02 | -0.191 | 22.577 | 22.815 |
| 82.16809222759392 | -2.827 | -0.54 | 23.24 | 23.45 |
| 82.33544068426926 | -2.624 | -0.883 | 24.05 | 24.254 |
| 82.50278914094459 | -2.416 | -1.237 | 24.917 | 25.122 |
| 82.67013759761994 | -2.212 | -1.566 | 25.675 | 25.879 |
| 82.83748605429528 | -2.011 | -1.889 | 26.419 | 26.625 |
| 83.00483451097062 | -1.825 | -2.158 | 27.237 | 27.449 |
| 83.17218296764597 | -1.636 | -2.435 | 27.978 | 28.192 |
| 83.33023428783935 | -1.517 | -2.569 | 28.513 | 28.73 |
| 83.4975827445147 | -1.426 | -2.65 | 28.998 | 29.221 |
| 83.66493120119004 | -1.36 | -2.664 | 29.386 | 29.614 |
| 83.83227965786537 | -1.31 | -2.653 | 29.671 | 29.898 |
| 83.99962811454073 | -1.278 | -2.619 | 29.864 | 30.091 |
| 84.16697657121607 | -1.269 | -2.534 | 29.934 | 30.164 |
| 84.33432502789142 | -1.277 | -2.417 | 29.92 | 30.15 |
| 84.50167348456677 | -1.305 | -2.254 | 29.87 | 30.092 |
| 84.6690219412421 | -1.363 | -1.986 | 29.691 | 29.911 |
| 84.83637039791745 | -1.428 | -1.7 | 29.36 | 29.568 |
| 85.0037188545928 | -1.537 | -1.326 | 28.929 | 29.118 |
| 85.17106731126813 | -1.672 | -0.904 | 28.435 | 28.612 |
| 85.33841576794349 | -1.83 | -0.45 | 27.825 | 28.016 |
| 85.50576422461883 | -1.968 | -0.039 | 27.142 | 27.333 |
| 85.66381554481221 | -2.118 | 0.41 | 26.392 | 26.608 |
| 85.83116400148755 | -2.279 | 0.866 | 25.554 | 25.792 |
| 85.99851245816289 | -2.421 | 1.268 | 24.772 | 25.031 |
| 86.16586091483823 | -2.56 | 1.675 | 24.038 | 24.322 |
| 86.33320937151358 | -2.668 | 2.027 | 23.463 | 23.794 |
| 86.50055782818893 | -2.769 | 2.386 | 22.948 | 23.349 |
| 86.66790628486427 | -2.876 | 2.776 | 22.46 | 22.936 |
| 86.83525474153961 | -2.968 | 3.135 | 22.088 | 22.635 |
| 87.00260319821496 | -3.042 | 3.423 | 21.849 | 22.471 |
| 87.16995165489031 | -3.084 | 3.663 | 21.708 | 22.396 |
| 87.33730011156564 | -3.117 | 3.878 | 21.622 | 22.369 |
| 87.504648568241 | -3.144 | 4.053 | 21.661 | 22.453 |
| 87.67199702491634 | -3.136 | 4.215 | 21.917 | 22.75 |
| 87.83004834510972 | -3.116 | 4.342 | 22.307 | 23.17 |
| 87.99739680178506 | -3.077 | 4.43 | 22.778 | 23.663 |
| 88.1647452584604 | -3.037 | 4.519 | 23.25 | 24.157 |
| 88.33209371513574 | -2.998 | 4.689 | 23.83 | 24.747 |
| 88.49944217181108 | -3.013 | 4.939 | 24.328 | 25.25 |
| 88.66679062848644 | -3.009 | 5.179 | 24.934 | 25.858 |
| 88.83413908516178 | -3.05 | 5.488 | 25.472 | 26.417 |
| 89.00148754183712 | -3.136 | 5.864 | 25.905 | 26.892 |
| 89.16883599851246 | -3.172 | 6.137 | 26.475 | 27.5 |
| 89.33618445518782 | -3.177 | 6.359 | 27.133 | 28.181 |
| 89.50353291186315 | -3.112 | 6.465 | 27.989 | 29.027 |
| 89.6708813685385 | -3 | 6.498 | 29.057 | 30.062 |
| 89.83822982521386 | -2.87 | 6.497 | 30.312 | 31.267 |
| 90.00557828188919 | -2.745 | 6.493 | 31.657 | 32.56 |
| 90.16362960208257 | -2.609 | 6.463 | 33.052 | 33.9 |
| 90.3309780587579 | -2.479 | 6.453 | 34.545 | 35.328 |
| 90.49832651543326 | -2.356 | 6.466 | 35.988 | 36.721 |
| 90.66567497210859 | -2.229 | 6.493 | 37.424 | 38.117 |
| 90.83302342878395 | -2.069 | 6.509 | 38.959 | 39.616 |
| 91.00037188545929 | -1.925 | 6.547 | 40.507 | 41.136 |
| 91.16772034213463 | -1.777 | 6.57 | 42.1 | 42.698 |
| 91.33506879880998 | -1.641 | 6.642 | 43.638 | 44.213 |
| 91.50241725548533 | -1.504 | 6.749 | 45.099 | 45.668 |
| 91.66976571216065 | -1.377 | 6.893 | 46.524 | 47.094 |
| 91.83711416883601 | -1.315 | 7.115 | 47.88 | 48.467 |
| 92.00446262551137 | -1.286 | 7.383 | 49.087 | 49.704 |
| 92.1718110821867 | -1.301 | 7.693 | 50.171 | 50.824 |
| 92.33915953886203 | -1.305 | 8.009 | 51.074 | 51.764 |
| 92.49721085905541 | -1.385 | 8.417 | 51.88 | 52.62 |
| 92.66455931573077 | -1.493 | 8.857 | 52.665 | 53.46 |
| 92.83190777240611 | -1.528 | 9.154 | 53.672 | 54.501 |
| 92.99925622908145 | -1.541 | 9.387 | 54.828 | 55.68 |
| 93.1666046857568 | -1.565 | 9.631 | 56.111 | 56.987 |
| 93.33395314243214 | -1.559 | 9.849 | 57.447 | 58.342 |
| 93.50130159910749 | -1.572 | 10.081 | 58.918 | 59.833 |
| 93.66865005578283 | -1.524 | 10.184 | 60.663 | 61.572 |
| 93.83599851245818 | -1.381 | 10.189 | 62.469 | 63.368 |
| 94.00334696913353 | -1.336 | 10.322 | 64.036 | 64.944 |
| 94.17069542580886 | -1.479 | 10.711 | 65.095 | 66.054 |
| 94.3380438824842 | -1.651 | 11.159 | 65.798 | 66.829 |
| 94.50539233915954 | -1.822 | 11.604 | 66.482 | 67.584 |
| 94.66344365935292 | -1.901 | 11.868 | 67.608 | 68.743 |
| 94.83079211602828 | -1.88 | 11.885 | 68.905 | 70.024 |
| 94.99814057270362 | -1.897 | 11.95 | 70.199 | 71.309 |
| 95.16548902937897 | -1.889 | 11.973 | 71.417 | 72.508 |
| 95.33283748605432 | -1.904 | 12.011 | 72.325 | 73.406 |
| 95.50018594272963 | -1.917 | 12.048 | 73.234 | 74.304 |
| 95.66753439940499 | -1.869 | 11.938 | 74.565 | 75.603 |
| 95.83488285608034 | -1.732 | 11.607 | 76.201 | 77.182 |
| 96.00223131275567 | -1.572 | 11.259 | 77.992 | 78.905 |
| 96.16957976943102 | -1.367 | 10.839 | 79.791 | 80.632 |
| 96.33692822610638 | -1.127 | 10.309 | 81.751 | 82.518 |
| 96.50427668278171 | -0.869 | 9.678 | 83.719 | 84.405 |
| 96.67162513945706 | -0.609 | 9.031 | 85.682 | 86.283 |
| 96.8389735961324 | -0.337 | 8.247 | 87.587 | 88.11 |
| 96.99702491632577 | -0.066 | 7.415 | 89.413 | 89.862 |
| 97.16437337300111 | 0.179 | 6.586 | 90.97 | 91.363 |
| 97.33172182967647 | 0.415 | 5.773 | 92.452 | 92.789 |
| 97.49907028635181 | 0.593 | 5.148 | 93.679 | 93.97 |
| 97.66641874302715 | 0.683 | 4.936 | 93.872 | 94.14 |
| 97.8337671997025 | 0.75 | 4.764 | 94.178 | 94.425 |
| 98.00111565637785 | 0.831 | 4.608 | 94.412 | 94.636 |
| 98.16846411305319 | 0.914 | 4.441 | 94.6 | 94.805 |
| 98.33581256972855 | 1.005 | 4.117 | 95.083 | 95.261 |
| 98.50316102640389 | 1.069 | 3.942 | 95.315 | 95.477 |
| 98.67050948307921 | 1.165 | 3.698 | 95.636 | 95.783 |
| 98.83785793975456 | 1.242 | 3.477 | 95.853 | 95.988 |
| 99.0052063964299 | 1.286 | 3.281 | 95.935 | 96.059 |
| 99.17255485310525 | 1.269 | 3.171 | 95.759 | 95.877 |
| 99.33060617329863 | 1.219 | 3.113 | 95.447 | 95.558 |
| 99.49795462997399 | 1.199 | 2.958 | 95.42 | 95.522 |
| 99.66530308664933 | 1.207 | 2.724 | 95.578 | 95.668 |
| 99.83265154332467 | 1.241 | 2.445 | 95.816 | 95.892 |
| 100.0 | 1.285 | 2.155 | 96.074 | 96.136 |